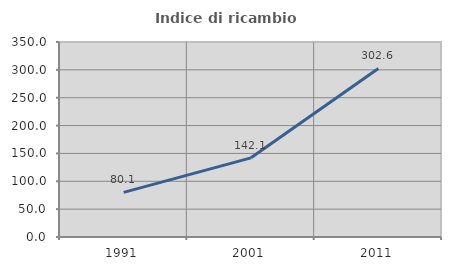
| Category | Indice di ricambio occupazionale  |
|---|---|
| 1991.0 | 80.126 |
| 2001.0 | 142.081 |
| 2011.0 | 302.564 |